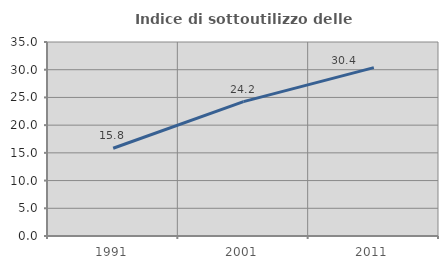
| Category | Indice di sottoutilizzo delle abitazioni  |
|---|---|
| 1991.0 | 15.83 |
| 2001.0 | 24.237 |
| 2011.0 | 30.385 |